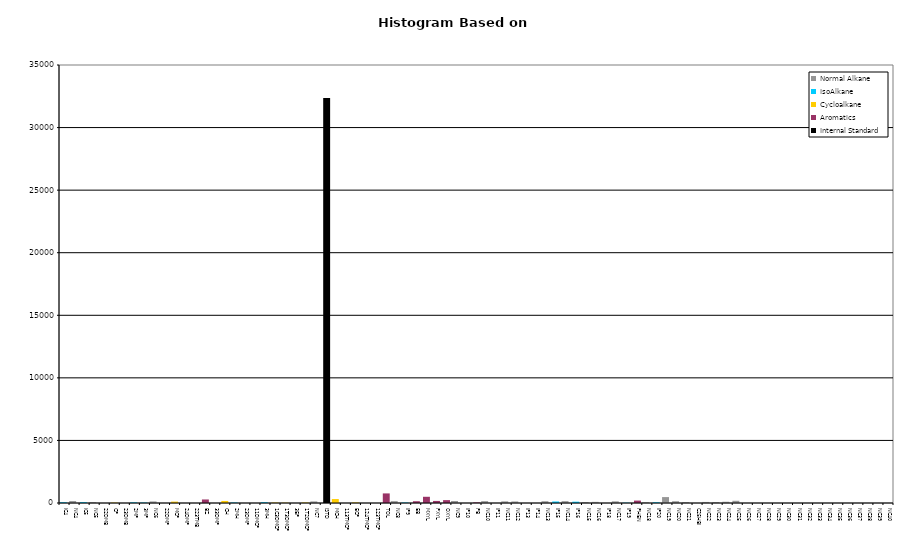
| Category | Normal Alkane | IsoAlkane | Cycloalkane | Aromatics | Internal Standard |
|---|---|---|---|---|---|
| IC4 | 0 | 58 | 0 | 0 | 0 |
| NC4 | 156 | 0 | 0 | 0 | 0 |
| IC5 | 0 | 66 | 0 | 0 | 0 |
| NC5 | 77 | 0 | 0 | 0 | 0 |
| 22DMB | 0 | 0 | 0 | 0 | 0 |
| CP | 0 | 0 | 28 | 0 | 0 |
| 23DMB | 0 | 0 | 0 | 0 | 0 |
| 2MP | 0 | 52 | 0 | 0 | 0 |
| 3MP | 0 | 37 | 0 | 0 | 0 |
| NC6 | 125 | 0 | 0 | 0 | 0 |
| 22DMP | 0 | 0 | 0 | 0 | 0 |
| MCP | 0 | 0 | 110 | 0 | 0 |
| 24DMP | 0 | 0 | 0 | 0 | 0 |
| 223TMB | 0 | 0 | 0 | 0 | 0 |
| BZ | 0 | 0 | 0 | 282 | 0 |
| 33DMP | 0 | 0 | 0 | 0 | 0 |
| CH | 0 | 0 | 164 | 0 | 0 |
| 2MH | 0 | 40 | 0 | 0 | 0 |
| 23DMP | 0 | 0 | 0 | 0 | 0 |
| 11DMCP | 0 | 0 | 0 | 0 | 0 |
| 3MH | 0 | 63 | 0 | 0 | 0 |
| 1C3DMCP | 0 | 0 | 34 | 0 | 0 |
| 1T3DMCP | 0 | 0 | 23 | 0 | 0 |
| 3EP | 0 | 0 | 0 | 0 | 0 |
| 1T2DMCP | 0 | 0 | 37 | 0 | 0 |
| NC7 | 127 | 0 | 0 | 0 | 0 |
| ISTD | 0 | 0 | 0 | 0 | 32367 |
| MCH | 0 | 0 | 315 | 0 | 0 |
| 113TMCP | 0 | 0 | 0 | 0 | 0 |
| ECP | 0 | 0 | 43 | 0 | 0 |
| 124TMCP | 0 | 0 | 0 | 0 | 0 |
| 123TMCP | 0 | 0 | 0 | 0 | 0 |
| TOL | 0 | 0 | 0 | 766 | 0 |
| NC8 | 149 | 0 | 0 | 0 | 0 |
| IP9 | 0 | 39 | 0 | 0 | 0 |
| EB | 0 | 0 | 0 | 142 | 0 |
| MXYL | 0 | 0 | 0 | 497 | 0 |
| PXYL | 0 | 0 | 0 | 165 | 0 |
| OXYL | 0 | 0 | 0 | 230 | 0 |
| NC9 | 160 | 0 | 0 | 0 | 0 |
| IP10 | 0 | 0 | 0 | 0 | 0 |
| PB | 0 | 0 | 0 | 47 | 0 |
| NC10 | 149 | 0 | 0 | 0 | 0 |
| IP11 | 0 | 0 | 0 | 0 | 0 |
| NC11 | 131 | 0 | 0 | 0 | 0 |
| NC12 | 123 | 0 | 0 | 0 | 0 |
| IP13 | 0 | 0 | 0 | 0 | 0 |
| IP14 | 0 | 0 | 0 | 0 | 0 |
| NC13 | 142 | 0 | 0 | 0 | 0 |
| IP15 | 0 | 121 | 0 | 0 | 0 |
| NC14 | 148 | 0 | 0 | 0 | 0 |
| IP16 | 0 | 105 | 0 | 0 | 0 |
| NC15 | 79 | 0 | 0 | 0 | 0 |
| NC16 | 90 | 0 | 0 | 0 | 0 |
| IP18 | 0 | 0 | 0 | 0 | 0 |
| NC17 | 132 | 0 | 0 | 0 | 0 |
| IP19 | 0 | 25 | 0 | 0 | 0 |
| PHEN | 0 | 0 | 0 | 193 | 0 |
| NC18 | 65 | 0 | 0 | 0 | 0 |
| IP20 | 0 | 58 | 0 | 0 | 0 |
| NC19 | 473 | 0 | 0 | 0 | 0 |
| NC20 | 142 | 0 | 0 | 0 | 0 |
| NC21 | 75 | 0 | 0 | 0 | 0 |
| C25HBI | 0 | 0 | 0 | 0 | 0 |
| NC22 | 84 | 0 | 0 | 0 | 0 |
| NC23 | 78 | 0 | 0 | 0 | 0 |
| NC24 | 100 | 0 | 0 | 0 | 0 |
| NC25 | 177 | 0 | 0 | 0 | 0 |
| NC26 | 0 | 0 | 0 | 0 | 0 |
| NC27 | 0 | 0 | 0 | 0 | 0 |
| NC28 | 0 | 0 | 0 | 0 | 0 |
| NC29 | 0 | 0 | 0 | 0 | 0 |
| NC30 | 0 | 0 | 0 | 0 | 0 |
| NC31 | 0 | 0 | 0 | 0 | 0 |
| NC32 | 0 | 0 | 0 | 0 | 0 |
| NC33 | 0 | 0 | 0 | 0 | 0 |
| NC34 | 0 | 0 | 0 | 0 | 0 |
| NC35 | 0 | 0 | 0 | 0 | 0 |
| NC36 | 0 | 0 | 0 | 0 | 0 |
| NC37 | 0 | 0 | 0 | 0 | 0 |
| NC38 | 0 | 0 | 0 | 0 | 0 |
| NC39 | 0 | 0 | 0 | 0 | 0 |
| NC40 | 0 | 0 | 0 | 0 | 0 |